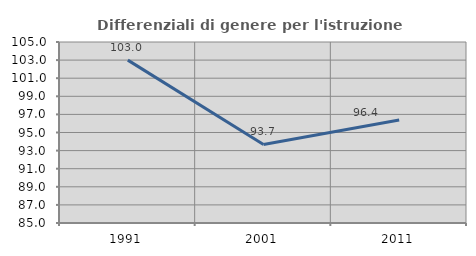
| Category | Differenziali di genere per l'istruzione superiore |
|---|---|
| 1991.0 | 102.996 |
| 2001.0 | 93.68 |
| 2011.0 | 96.385 |